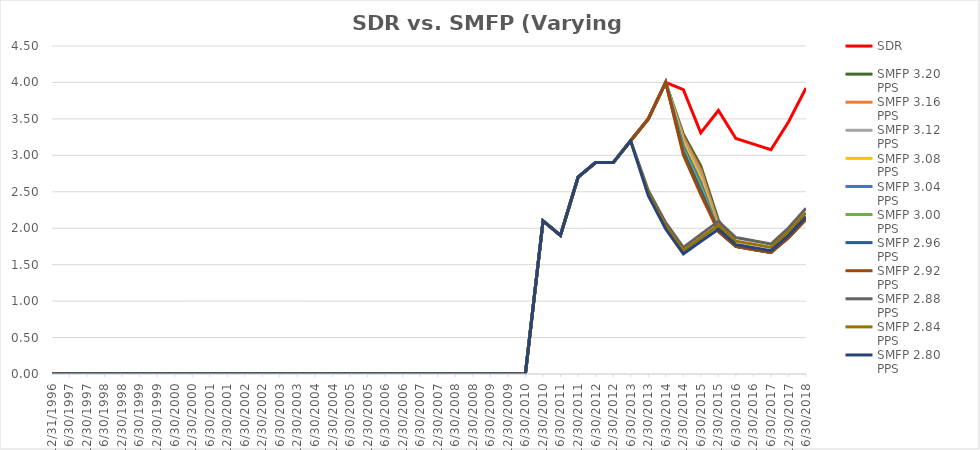
| Category | SDR | SMFP 3.20 PPS | SMFP 3.16 PPS | SMFP 3.12 PPS | SMFP 3.08 PPS | SMFP 3.04 PPS | SMFP 3.00 PPS | SMFP 2.96 PPS | SMFP 2.92 PPS | SMFP 2.88 PPS | SMFP 2.84 PPS | SMFP 2.80 PPS |
|---|---|---|---|---|---|---|---|---|---|---|---|---|
| 12/31/96 | 0 | 0 | 0 | 0 | 0 | 0 | 0 | 0 | 0 | 0 | 0 | 0 |
| 6/30/97 | 0 | 0 | 0 | 0 | 0 | 0 | 0 | 0 | 0 | 0 | 0 | 0 |
| 12/31/97 | 0 | 0 | 0 | 0 | 0 | 0 | 0 | 0 | 0 | 0 | 0 | 0 |
| 6/30/98 | 0 | 0 | 0 | 0 | 0 | 0 | 0 | 0 | 0 | 0 | 0 | 0 |
| 12/31/98 | 0 | 0 | 0 | 0 | 0 | 0 | 0 | 0 | 0 | 0 | 0 | 0 |
| 6/30/99 | 0 | 0 | 0 | 0 | 0 | 0 | 0 | 0 | 0 | 0 | 0 | 0 |
| 12/31/99 | 0 | 0 | 0 | 0 | 0 | 0 | 0 | 0 | 0 | 0 | 0 | 0 |
| 6/30/00 | 0 | 0 | 0 | 0 | 0 | 0 | 0 | 0 | 0 | 0 | 0 | 0 |
| 12/31/00 | 0 | 0 | 0 | 0 | 0 | 0 | 0 | 0 | 0 | 0 | 0 | 0 |
| 6/30/01 | 0 | 0 | 0 | 0 | 0 | 0 | 0 | 0 | 0 | 0 | 0 | 0 |
| 12/31/01 | 0 | 0 | 0 | 0 | 0 | 0 | 0 | 0 | 0 | 0 | 0 | 0 |
| 6/30/02 | 0 | 0 | 0 | 0 | 0 | 0 | 0 | 0 | 0 | 0 | 0 | 0 |
| 12/31/02 | 0 | 0 | 0 | 0 | 0 | 0 | 0 | 0 | 0 | 0 | 0 | 0 |
| 6/30/03 | 0 | 0 | 0 | 0 | 0 | 0 | 0 | 0 | 0 | 0 | 0 | 0 |
| 12/31/03 | 0 | 0 | 0 | 0 | 0 | 0 | 0 | 0 | 0 | 0 | 0 | 0 |
| 6/30/04 | 0 | 0 | 0 | 0 | 0 | 0 | 0 | 0 | 0 | 0 | 0 | 0 |
| 12/31/04 | 0 | 0 | 0 | 0 | 0 | 0 | 0 | 0 | 0 | 0 | 0 | 0 |
| 6/30/05 | 0 | 0 | 0 | 0 | 0 | 0 | 0 | 0 | 0 | 0 | 0 | 0 |
| 12/31/05 | 0 | 0 | 0 | 0 | 0 | 0 | 0 | 0 | 0 | 0 | 0 | 0 |
| 6/30/06 | 0 | 0 | 0 | 0 | 0 | 0 | 0 | 0 | 0 | 0 | 0 | 0 |
| 12/31/06 | 0 | 0 | 0 | 0 | 0 | 0 | 0 | 0 | 0 | 0 | 0 | 0 |
| 6/30/07 | 0 | 0 | 0 | 0 | 0 | 0 | 0 | 0 | 0 | 0 | 0 | 0 |
| 12/31/07 | 0 | 0 | 0 | 0 | 0 | 0 | 0 | 0 | 0 | 0 | 0 | 0 |
| 6/30/08 | 0 | 0 | 0 | 0 | 0 | 0 | 0 | 0 | 0 | 0 | 0 | 0 |
| 12/31/08 | 0 | 0 | 0 | 0 | 0 | 0 | 0 | 0 | 0 | 0 | 0 | 0 |
| 6/30/09 | 0 | 0 | 0 | 0 | 0 | 0 | 0 | 0 | 0 | 0 | 0 | 0 |
| 12/31/09 | 0 | 0 | 0 | 0 | 0 | 0 | 0 | 0 | 0 | 0 | 0 | 0 |
| 6/30/10 | 0 | 0 | 0 | 0 | 0 | 0 | 0 | 0 | 0 | 0 | 0 | 0 |
| 12/31/10 | 2.1 | 2.1 | 2.1 | 2.1 | 2.1 | 2.1 | 2.1 | 2.1 | 2.1 | 2.1 | 2.1 | 2.1 |
| 6/30/11 | 1.9 | 1.9 | 1.9 | 1.9 | 1.9 | 1.9 | 1.9 | 1.9 | 1.9 | 1.9 | 1.9 | 1.9 |
| 12/31/11 | 2.7 | 2.7 | 2.7 | 2.7 | 2.7 | 2.7 | 2.7 | 2.7 | 2.7 | 2.7 | 2.7 | 2.7 |
| 6/30/12 | 2.9 | 2.9 | 2.9 | 2.9 | 2.9 | 2.9 | 2.9 | 2.9 | 2.9 | 2.9 | 2.9 | 2.9 |
| 12/31/12 | 2.9 | 2.9 | 2.9 | 2.9 | 2.9 | 2.9 | 2.9 | 2.9 | 2.9 | 2.9 | 2.9 | 2.9 |
| 6/30/13 | 3.2 | 3.2 | 3.2 | 3.2 | 3.2 | 3.2 | 3.2 | 3.2 | 3.2 | 3.2 | 3.2 | 3.2 |
| 12/31/13 | 3.5 | 3.5 | 3.5 | 3.5 | 3.5 | 3.5 | 3.5 | 3.5 | 3.5 | 2.517 | 2.482 | 2.447 |
| 6/30/14 | 4 | 4 | 4 | 4 | 4 | 4 | 4 | 4 | 4 | 2.075 | 2.032 | 1.989 |
| 12/31/14 | 3.9 | 3.291 | 3.249 | 3.208 | 3.167 | 3.126 | 3.085 | 3.044 | 3.003 | 1.738 | 1.693 | 1.649 |
| 6/30/15 | 3.308 | 2.857 | 2.798 | 2.74 | 2.683 | 2.627 | 2.571 | 2.517 | 2.464 | 1.916 | 1.866 | 1.818 |
| 12/31/15 | 3.615 | 2.108 | 2.059 | 2.01 | 1.963 | 1.958 | 1.958 | 1.958 | 1.958 | 2.094 | 2.04 | 1.987 |
| 6/30/16 | 3.231 | 1.75 | 1.75 | 1.75 | 1.75 | 1.75 | 1.75 | 1.75 | 1.75 | 1.871 | 1.823 | 1.775 |
| 12/31/16 | 3.154 | 1.708 | 1.708 | 1.708 | 1.708 | 1.708 | 1.708 | 1.708 | 1.708 | 1.827 | 1.779 | 1.733 |
| 6/30/17 | 3.077 | 1.667 | 1.667 | 1.667 | 1.667 | 1.667 | 1.667 | 1.667 | 1.667 | 1.782 | 1.736 | 1.691 |
| 12/31/17 | 3.462 | 1.875 | 1.875 | 1.875 | 1.875 | 1.875 | 1.875 | 1.875 | 1.875 | 2.005 | 1.953 | 1.902 |
| 6/30/18 | 3.923 | 2.125 | 2.125 | 2.125 | 2.125 | 2.125 | 2.125 | 2.125 | 2.125 | 2.272 | 2.213 | 2.156 |